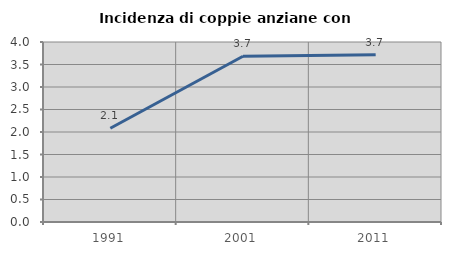
| Category | Incidenza di coppie anziane con figli |
|---|---|
| 1991.0 | 2.083 |
| 2001.0 | 3.684 |
| 2011.0 | 3.719 |